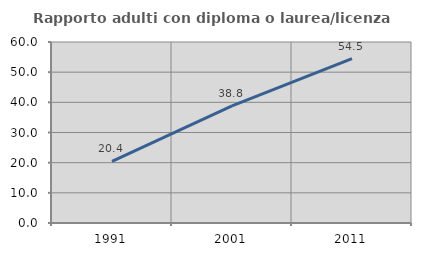
| Category | Rapporto adulti con diploma o laurea/licenza media  |
|---|---|
| 1991.0 | 20.423 |
| 2001.0 | 38.799 |
| 2011.0 | 54.511 |